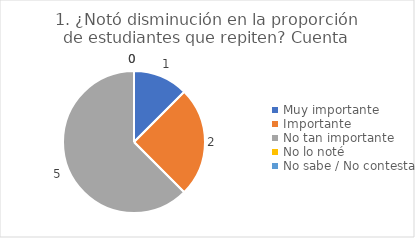
| Category | 1. ¿Notó disminución en la proporción de estudiantes que repiten? |
|---|---|
| Muy importante  | 0.125 |
| Importante  | 0.25 |
| No tan importante  | 0.625 |
| No lo noté  | 0 |
| No sabe / No contesta | 0 |